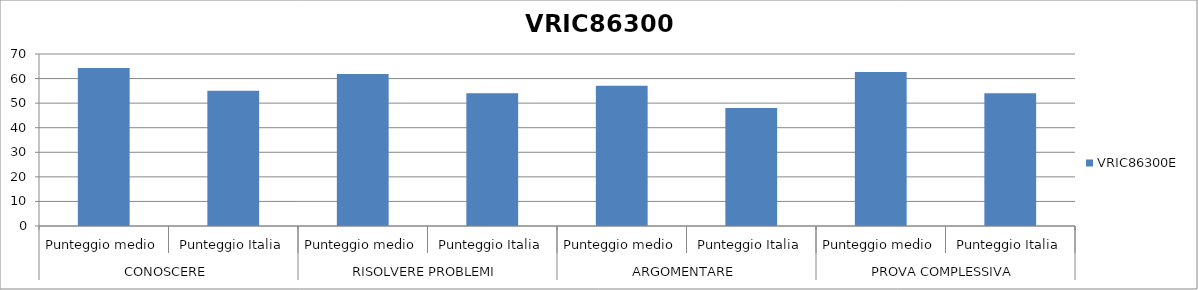
| Category | VRIC86300E |
|---|---|
| 0 | 64.3 |
| 1 | 55 |
| 2 | 61.9 |
| 3 | 54 |
| 4 | 57.1 |
| 5 | 48 |
| 6 | 62.7 |
| 7 | 54 |